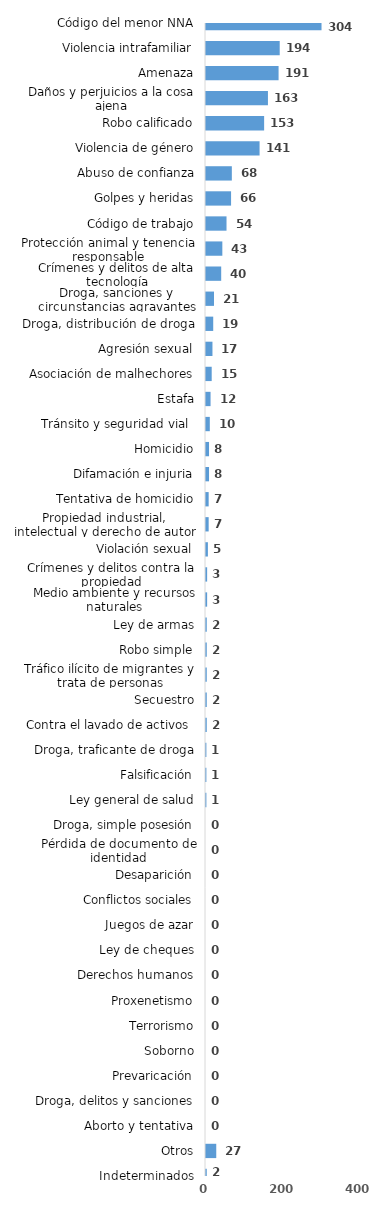
| Category | Series 0 |
|---|---|
| Código del menor NNA | 304 |
| Violencia intrafamiliar | 194 |
| Amenaza | 191 |
| Daños y perjuicios a la cosa ajena | 163 |
| Robo calificado | 153 |
| Violencia de género | 141 |
| Abuso de confianza | 68 |
| Golpes y heridas | 66 |
| Código de trabajo | 54 |
| Protección animal y tenencia responsable | 43 |
| Crímenes y delitos de alta tecnología | 40 |
| Droga, sanciones y circunstancias agravantes | 21 |
| Droga, distribución de droga | 19 |
| Agresión sexual | 17 |
| Asociación de malhechores | 15 |
| Estafa | 12 |
| Tránsito y seguridad vial  | 10 |
| Homicidio | 8 |
| Difamación e injuria | 8 |
| Tentativa de homicidio | 7 |
| Propiedad industrial, intelectual y derecho de autor | 7 |
| Violación sexual | 5 |
| Crímenes y delitos contra la propiedad | 3 |
| Medio ambiente y recursos naturales | 3 |
| Ley de armas | 2 |
| Robo simple | 2 |
| Tráfico ilícito de migrantes y trata de personas | 2 |
| Secuestro | 2 |
| Contra el lavado de activos  | 2 |
| Droga, traficante de droga | 1 |
| Falsificación | 1 |
| Ley general de salud | 1 |
| Droga, simple posesión | 0 |
| Pérdida de documento de identidad | 0 |
| Desaparición | 0 |
| Conflictos sociales | 0 |
| Juegos de azar | 0 |
| Ley de cheques | 0 |
| Derechos humanos | 0 |
| Proxenetismo | 0 |
| Terrorismo | 0 |
| Soborno | 0 |
| Prevaricación | 0 |
| Droga, delitos y sanciones | 0 |
| Aborto y tentativa | 0 |
| Otros | 27 |
| Indeterminados | 2 |